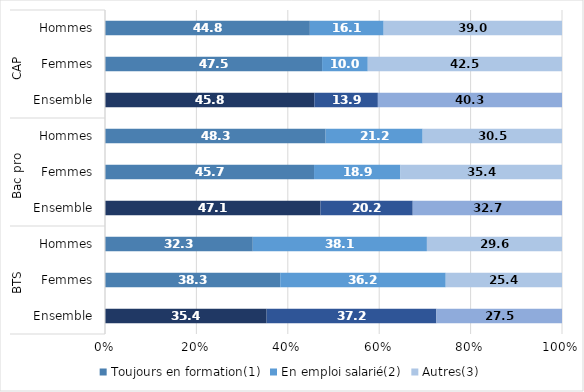
| Category | Toujours en formation(1) | En emploi salarié(2) | Autres(3) |
|---|---|---|---|
| 0 | 35.367 | 37.15 | 27.483 |
| 1 | 38.344 | 36.214 | 25.442 |
| 2 | 32.339 | 38.103 | 29.558 |
| 3 | 47.146 | 20.191 | 32.662 |
| 4 | 45.741 | 18.907 | 35.352 |
| 5 | 48.281 | 21.228 | 30.491 |
| 6 | 45.803 | 13.905 | 40.292 |
| 7 | 47.5 | 10 | 42.5 |
| 8 | 44.828 | 16.149 | 39.023 |